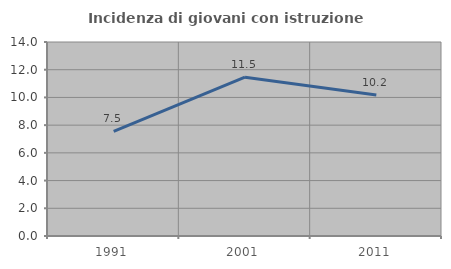
| Category | Incidenza di giovani con istruzione universitaria |
|---|---|
| 1991.0 | 7.547 |
| 2001.0 | 11.462 |
| 2011.0 | 10.169 |